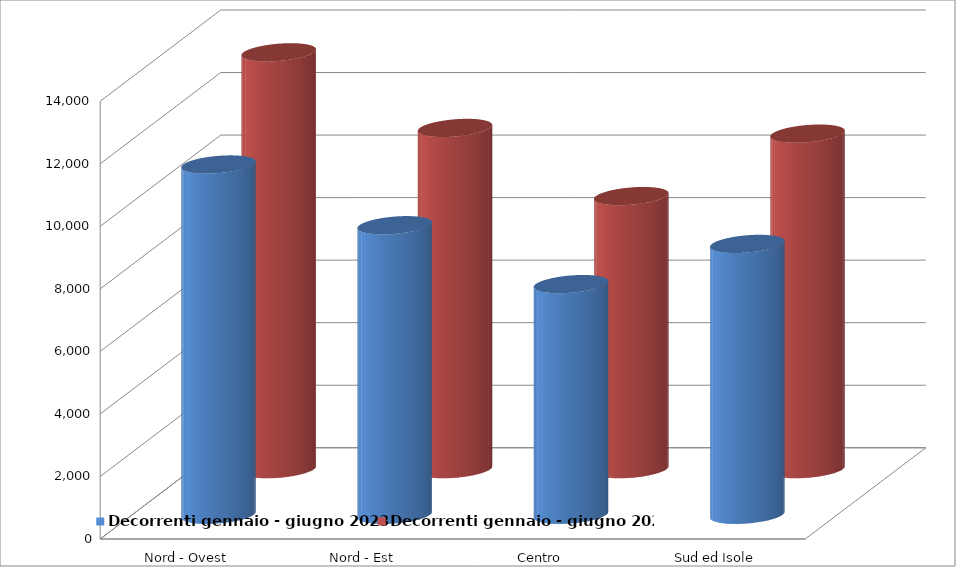
| Category | Decorrenti gennaio - giugno 2023 | Decorrenti gennaio - giugno 2022 |
|---|---|---|
| Nord - Ovest | 11204 | 13333 |
| Nord - Est | 9262 | 10914 |
| Centro | 7379 | 8735 |
| Sud ed Isole | 8664 | 10732 |